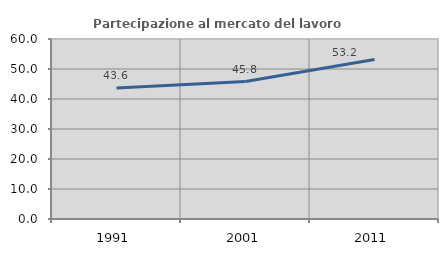
| Category | Partecipazione al mercato del lavoro  femminile |
|---|---|
| 1991.0 | 43.632 |
| 2001.0 | 45.83 |
| 2011.0 | 53.182 |